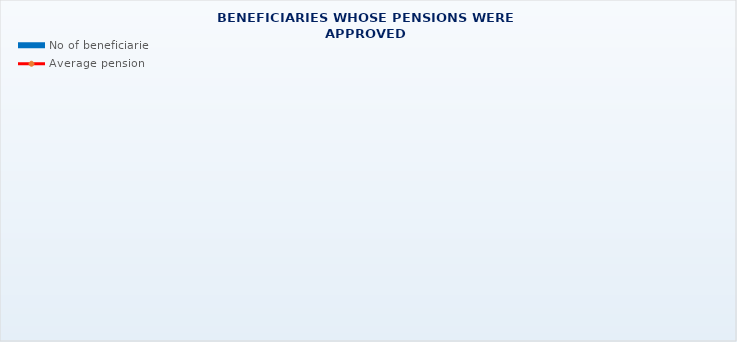
| Category | No of beneficiaries |
|---|---|
| Authorised officials in internal affairs, judicial officers and workers engaged in demining work: | 17264 |
| Pension beneficiaries entitled under the Fire Services Act (Official Gazette 125/19)* | 59 |
| Active military personnel - DVO  | 15839 |
| Croatian Homeland Army veterans mobilised from 1941 to 1945 | 3516 |
| Former political prisoners | 2675 |
| Croatian Veterans from the Homeland War - ZOHBDR (Act on Croatian Homeland War Veterans and Their Family Members) | 71123 |
| Pensions approved under general regulations and determined according to the Act on the Rights of Croatian Homeland War Veterans and their Family Members (ZOHBDR), in 2017 (Art. 27, 35, 48 and 49, paragraph 2)    | 46202 |
| Former Yugoslav People's Army members - JNA   | 5027 |
| Former Yugoslav People's Army members - JNA - Art. 185 of Pension Insurance Act (ZOMO)  | 155 |
| National Liberation War veterans - NOR | 8480 |
| Members of the Croatian Parliament, members of the Government, judges of the Constitutional Court and the Auditor General | 686 |
| Members of the Parliamentary Executive Council and administratively retired federal civil servants  (relates to the former SFRY) | 89 |
| Former officials of federal bodies o the former SFRJ -  Article 38 of the Pension Insurance Act (ZOMO) | 29 |
| Full members of the Croatian Academy of Sciences and Arts - HAZU | 135 |
| Miners from the Istrian coal mines "Tupljak" d.d. Labin  | 254 |
| Workers professionally exposed to asbestos | 860 |
| Insurees - crew members on a ship in international and national navigation  - Article  129, paragraph 2 of the Maritime Code | 185 |
| Members of the Croatian Defence Council - HVO  | 6757 |